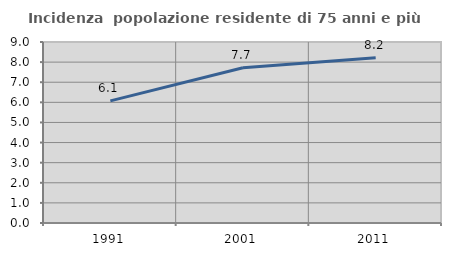
| Category | Incidenza  popolazione residente di 75 anni e più |
|---|---|
| 1991.0 | 6.072 |
| 2001.0 | 7.719 |
| 2011.0 | 8.22 |